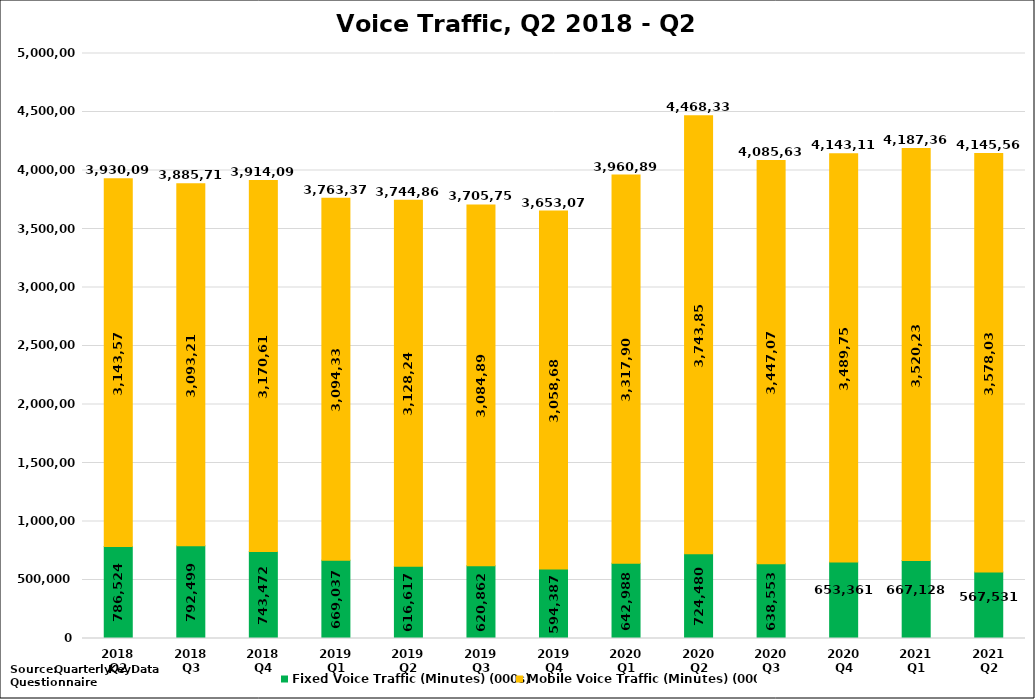
| Category | Fixed Voice Traffic (Minutes) (000s) | Mobile Voice Traffic (Minutes) (000s) | Total Voice Traffic (Minutes) (000s) |
|---|---|---|---|
| 2018 Q2 | 786524.18 | 3143570.668 | 3930094.848 |
| 2018 Q3 | 792498.739 | 3093216.219 | 3885714.958 |
| 2018 Q4 | 743472.478 | 3170618.882 | 3914091.36 |
| 2019 Q1 | 669036.816 | 3094332.692 | 3763369.508 |
| 2019 Q2 | 616616.925 | 3128245.304 | 3744862.229 |
| 2019 Q3 | 620861.947 | 3084892.681 | 3705754.628 |
| 2019 Q4 | 594387.173 | 3058682.507 | 3653069.68 |
| 2020 Q1 | 642988 | 3317905.957 | 3960893.957 |
| 2020 Q2 | 724479.867 | 3743853.177 | 4468333.044 |
| 2020 Q3 | 638552.857 | 3447078.57 | 4085631.427 |
| 2020 Q4 | 653361.114 | 3489753.623 | 4143114.737 |
| 2021 Q1 | 667128.36 | 3520235.601 | 4187363.961 |
| 2021 Q2 | 567531.361 | 3578036.277 | 4145567.638 |